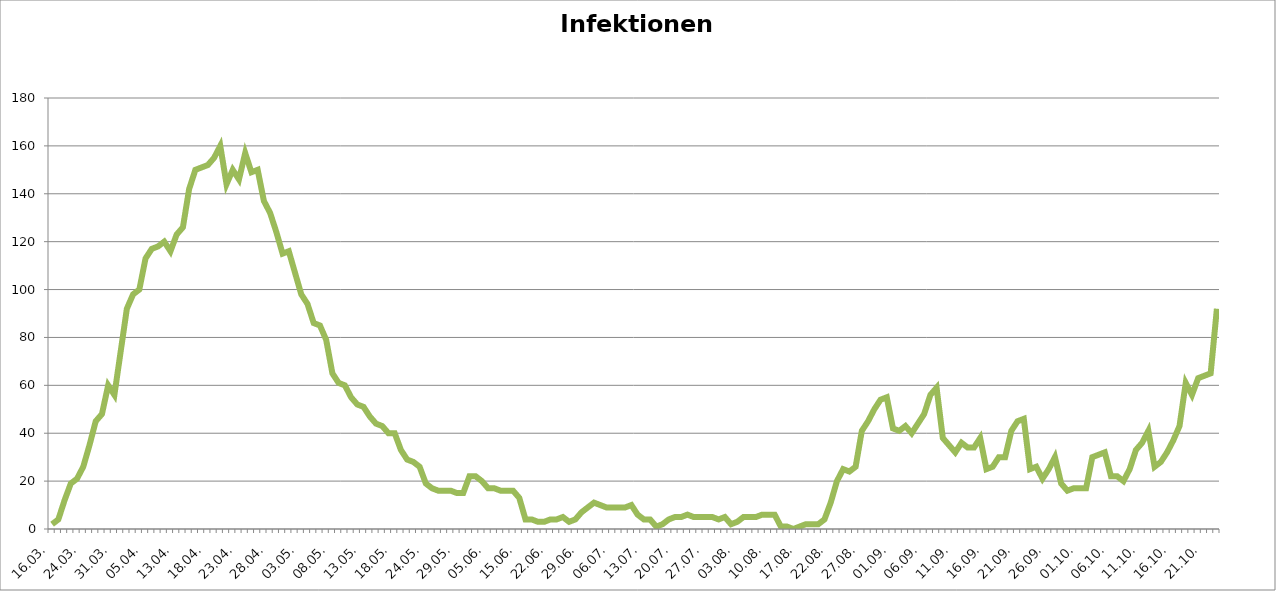
| Category | Infektionen
aktuell |
|---|---|
| 16.03. | 2 |
| 18.03. | 4 |
| 19.03. | 12 |
| 20.03. | 19 |
| 23.03. | 21 |
| 24.03. | 26 |
| 25.03. | 35 |
| 26.03. | 45 |
| 27.03. | 48 |
| 30.03. | 60 |
| 31.03. | 56 |
| 01.04. | 74 |
| 02.04. | 92 |
| 03.04. | 98 |
| 04.04. | 100 |
| 05.04. | 113 |
| 06.04. | 117 |
| 07.04. | 118 |
| 08.04. | 120 |
| 09.04. | 116 |
| 13.04. | 123 |
| 14.04. | 126 |
| 15.04. | 142 |
| 16.04. | 150 |
| 17.04. | 151 |
| 18.04. | 152 |
| 19.04. | 155 |
| 20.04. | 160 |
| 21.04. | 144 |
| 22.04. | 150 |
| 23.04. | 146 |
| 24.04. | 157 |
| 25.04. | 149 |
| 26.04. | 150 |
| 27.04. | 137 |
| 28.04. | 132 |
| 29.04. | 124 |
| 30.04. | 115 |
| 01.05. | 116 |
| 02.05. | 107 |
| 03.05. | 98 |
| 04.05. | 94 |
| 05.05. | 86 |
| 06.05. | 85 |
| 07.05. | 79 |
| 08.05. | 65 |
| 09.05. | 61 |
| 10.05. | 60 |
| 11.05. | 55 |
| 12.05. | 52 |
| 13.05. | 51 |
| 14.05. | 47 |
| 15.05. | 44 |
| 16.05. | 43 |
| 17.05. | 40 |
| 18.05. | 40 |
| 19.05. | 33 |
| 20.05. | 29 |
| 22.05. | 28 |
| 23.05. | 26 |
| 24.05. | 19 |
| 25.05. | 17 |
| 26.05. | 16 |
| 27.05. | 16 |
| 28.05. | 16 |
| 29.05. | 15 |
| 30.05. | 15 |
| 02.06. | 22 |
| 03.06. | 22 |
| 04.06. | 20 |
| 05.06. | 17 |
| 08.06. | 17 |
| 09.06. | 16 |
| 10.06. | 16 |
| 12.06. | 16 |
| 15.06. | 13 |
| 16.06. | 4 |
| 17.06. | 4 |
| 18.06. | 3 |
| 19.06. | 3 |
| 22.06. | 4 |
| 23.06. | 4 |
| 24.06. | 5 |
| 25.06. | 3 |
| 26.06. | 4 |
| 29.06. | 7 |
| 30.06. | 9 |
| 01.07. | 11 |
| 02.07. | 10 |
| 03.07. | 9 |
| 06.07. | 9 |
| 07.07. | 9 |
| 08.07. | 9 |
| 09.07. | 10 |
| 10.07. | 6 |
| 13.07. | 4 |
| 14.07. | 4 |
| 15.07. | 1 |
| 16.07. | 2 |
| 17.07. | 4 |
| 20.07. | 5 |
| 21.07. | 5 |
| 22.07. | 6 |
| 23.07. | 5 |
| 24.07. | 5 |
| 27.07. | 5 |
| 28.07. | 5 |
| 29.07. | 4 |
| 30.07. | 5 |
| 31.07. | 2 |
| 03.08. | 3 |
| 04.08. | 5 |
| 05.08. | 5 |
| 06.08. | 5 |
| 07.08. | 6 |
| 10.08. | 6 |
| 11.08. | 6 |
| 12.08. | 1 |
| 13.08. | 1 |
| 14.08. | 0 |
| 17.08. | 1 |
| 18.08. | 2 |
| 19.08. | 2 |
| 20.08. | 2 |
| 21.08. | 4 |
| 22.08. | 11 |
| 23.08. | 20 |
| 24.08. | 25 |
| 25.08. | 24 |
| 26.08. | 26 |
| 27.08. | 41 |
| 28.08. | 45 |
| 29.08. | 50 |
| 30.08. | 54 |
| 31.08. | 55 |
| 01.09. | 42 |
| 02.09. | 41 |
| 03.09. | 43 |
| 04.09. | 40 |
| 05.09. | 44 |
| 06.09. | 48 |
| 07.09. | 56 |
| 08.09. | 59 |
| 09.09. | 38 |
| 10.09. | 35 |
| 11.09. | 32 |
| 12.09. | 36 |
| 13.09. | 34 |
| 14.09. | 34 |
| 15.09. | 38 |
| 16.09. | 25 |
| 17.09. | 26 |
| 18.09. | 30 |
| 19.09. | 30 |
| 20.09. | 41 |
| 21.09. | 45 |
| 22.09. | 46 |
| 23.o9. | 25 |
| 24.09. | 26 |
| 25.09. | 21 |
| 26.09. | 25 |
| 27.09. | 30 |
| 28.09. | 19 |
| 29.09. | 16 |
| 30.09. | 17 |
| 01.10. | 17 |
| 02.10. | 17 |
| 03.10. | 30 |
| 04.10. | 31 |
| 05.10. | 32 |
| 06.10. | 22 |
| 07.10. | 22 |
| 08.10. | 20 |
| 09.10. | 25 |
| 10.10. | 33 |
| 11.10. | 36 |
| 12.10. | 41 |
| 13.10. | 26 |
| 14.10. | 28 |
| 15.10. | 32 |
| 16.10. | 37 |
| 17.10. | 43 |
| 18.10. | 61 |
| 19.10. | 56 |
| 20.10. | 63 |
| 21.10. | 64 |